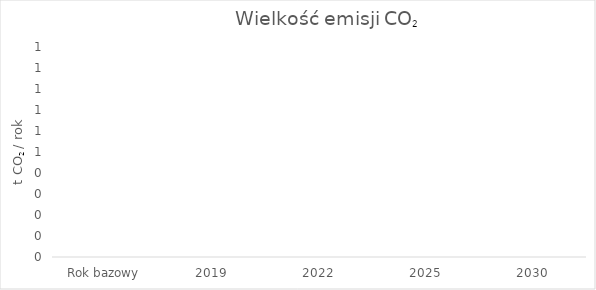
| Category | Series 0 |
|---|---|
| Rok bazowy | 0 |
| 2019 | 0 |
| 2022 | 0 |
| 2025 | 0 |
| 2030 | 0 |